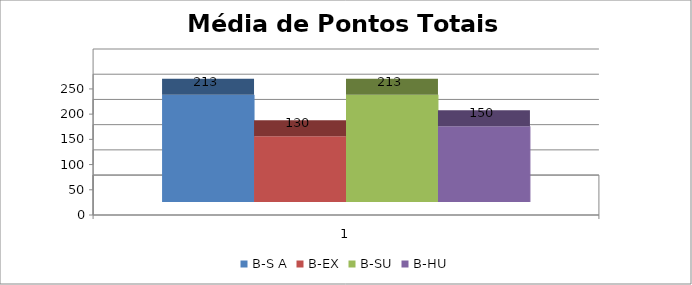
| Category | B-S A | B-EX | B-SU | B-HU |
|---|---|---|---|---|
| 0 | 212.661 | 130.246 | 212.709 | 150 |